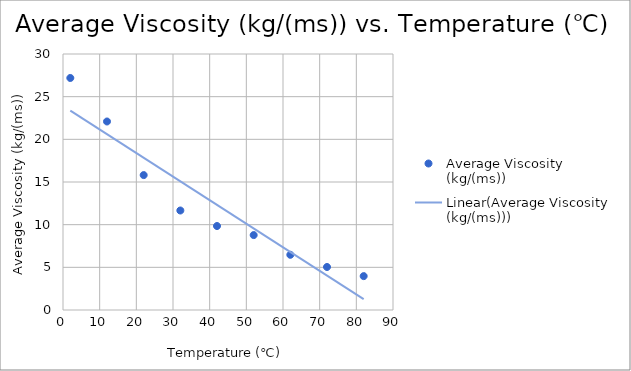
| Category | Average Viscosity (kg/(ms)) |
|---|---|
| 2.0 | 27.19 |
| 12.0 | 22.09 |
| 22.0 | 15.81 |
| 32.0 | 11.66 |
| 42.0 | 9.84 |
| 52.0 | 8.78 |
| 62.0 | 6.47 |
| 72.0 | 5.04 |
| 82.0 | 3.97 |